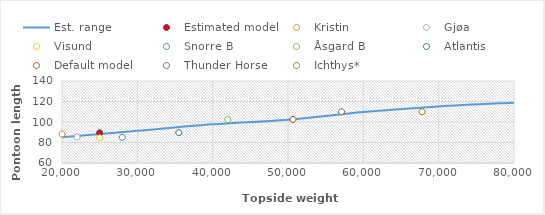
| Category | Est. range |
|---|---|
| 20000.0 | 85 |
| 30000.0 | 91.4 |
| 40000.0 | 97.7 |
| 50000.0 | 102.3 |
| 60000.0 | 109.7 |
| 70000.0 | 115.2 |
| 80000.0 | 118.9 |